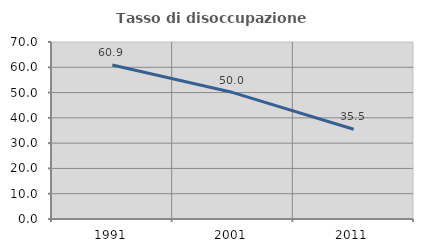
| Category | Tasso di disoccupazione giovanile  |
|---|---|
| 1991.0 | 60.87 |
| 2001.0 | 50 |
| 2011.0 | 35.484 |